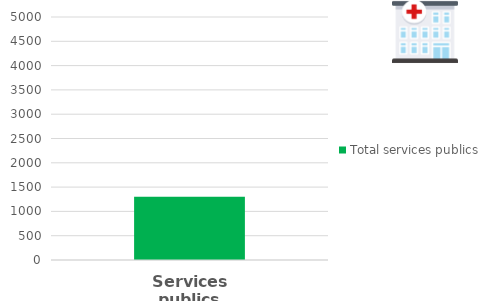
| Category | Total services publics |
|---|---|
| 0 | 1300 |